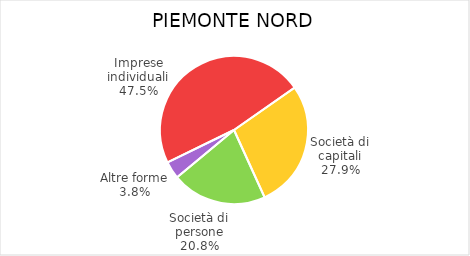
| Category | Piemonte Nord |
|---|---|
| Imprese individuali | 26004 |
| Società di capitali | 15277 |
| Società di persone | 11360 |
| Altre forme | 2085 |